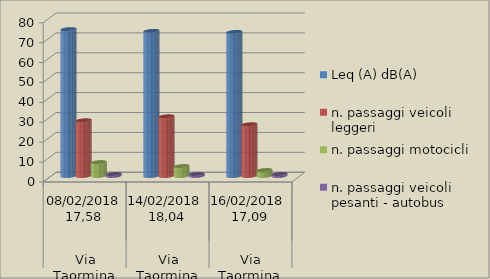
| Category | Leq (A) dB(A) | n. passaggi veicoli leggeri  | n. passaggi motocicli | n. passaggi veicoli pesanti - autobus  |
|---|---|---|---|---|
| 0 | 73.8 | 28 | 7 | 1 |
| 1 | 72.9 | 30 | 5 | 1 |
| 2 | 72.4 | 26 | 3 | 1 |